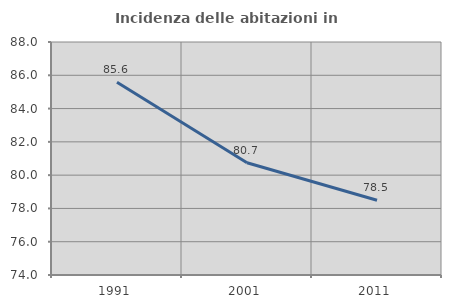
| Category | Incidenza delle abitazioni in proprietà  |
|---|---|
| 1991.0 | 85.583 |
| 2001.0 | 80.748 |
| 2011.0 | 78.491 |